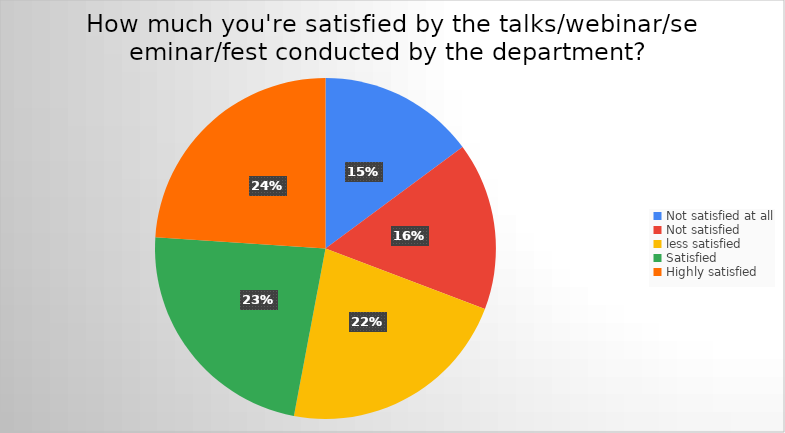
| Category | Series 0 |
|---|---|
| Not satisfied at all | 85 |
| Not satisfied  | 91 |
| less satisfied | 127 |
| Satisfied | 132 |
| Highly satisfied | 137 |